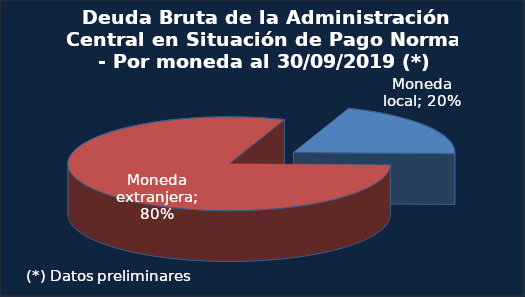
| Category | Series 0 |
|---|---|
| Moneda local (1) | 0.199 |
| Moneda extranjera | 0.801 |